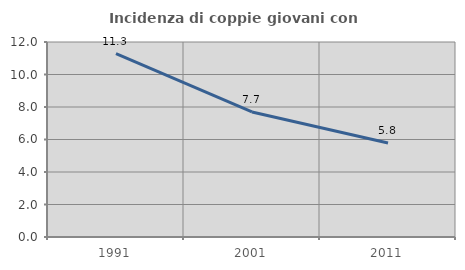
| Category | Incidenza di coppie giovani con figli |
|---|---|
| 1991.0 | 11.289 |
| 2001.0 | 7.694 |
| 2011.0 | 5.78 |